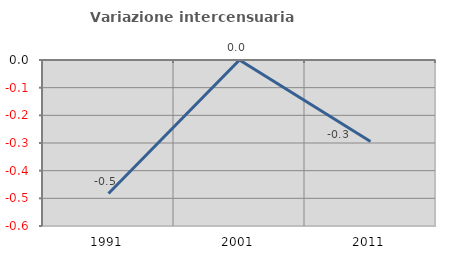
| Category | Variazione intercensuaria annua |
|---|---|
| 1991.0 | -0.483 |
| 2001.0 | 0 |
| 2011.0 | -0.294 |